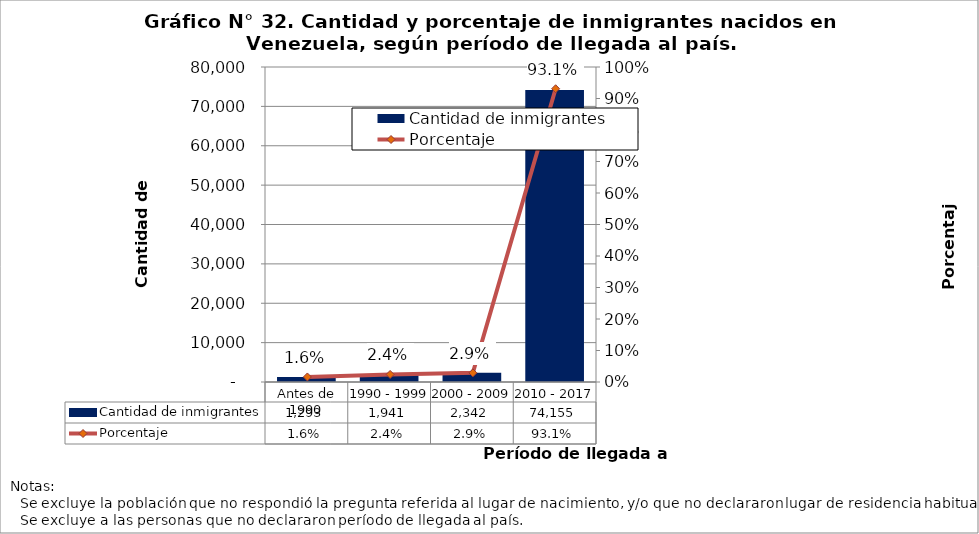
| Category | Cantidad de inmigrantes |
|---|---|
| Antes de 1990 | 1293 |
| 1990 - 1999 | 1941 |
| 2000 - 2009 | 2342 |
| 2010 - 2017 | 74155 |